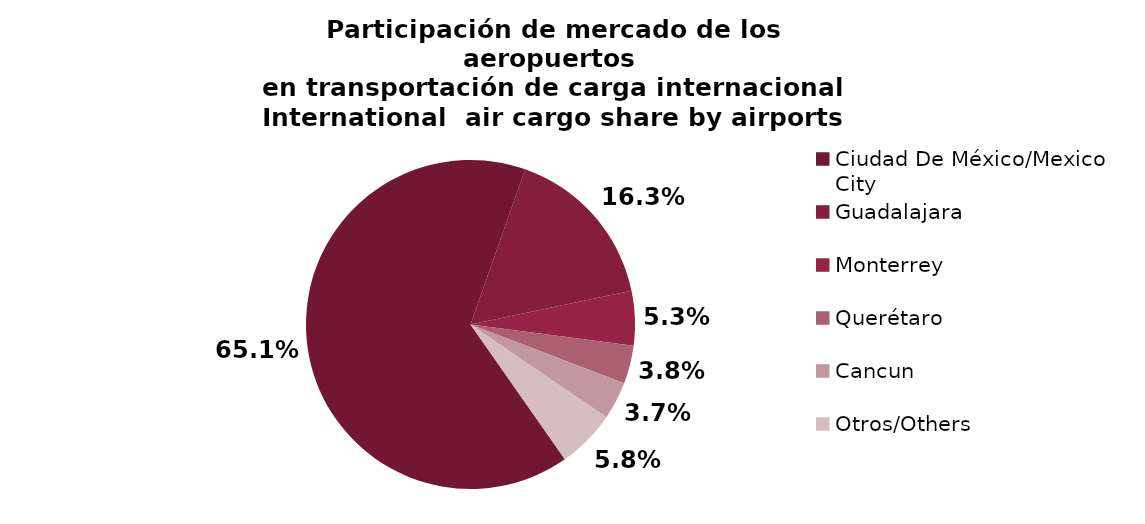
| Category | Series 0 |
|---|---|
| Ciudad De México/Mexico City | 33985.24 |
| Guadalajara | 8516.602 |
| Monterrey | 2785.913 |
| Querétaro | 1966.679 |
| Cancun | 1935.646 |
| Otros/Others | 3000.593 |